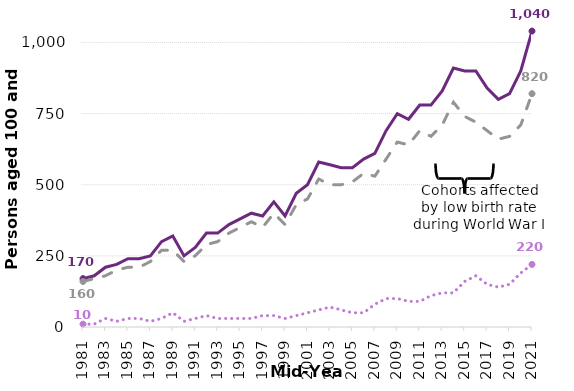
| Category | Persons | Females | Males |
|---|---|---|---|
| 1981.0 | 170 | 160 | 10 |
| 1982.0 | 180 | 170 | 10 |
| 1983.0 | 210 | 180 | 30 |
| 1984.0 | 220 | 200 | 20 |
| 1985.0 | 240 | 210 | 30 |
| 1986.0 | 240 | 210 | 30 |
| 1987.0 | 250 | 230 | 20 |
| 1988.0 | 300 | 270 | 30 |
| 1989.0 | 320 | 270 | 50 |
| 1990.0 | 250 | 230 | 20 |
| 1991.0 | 280 | 250 | 30 |
| 1992.0 | 330 | 290 | 40 |
| 1993.0 | 330 | 300 | 30 |
| 1994.0 | 360 | 330 | 30 |
| 1995.0 | 380 | 350 | 30 |
| 1996.0 | 400 | 370 | 30 |
| 1997.0 | 390 | 350 | 40 |
| 1998.0 | 440 | 400 | 40 |
| 1999.0 | 390 | 360 | 30 |
| 2000.0 | 470 | 430 | 40 |
| 2001.0 | 500 | 450 | 50 |
| 2002.0 | 580 | 520 | 60 |
| 2003.0 | 570 | 500 | 70 |
| 2004.0 | 560 | 500 | 60 |
| 2005.0 | 560 | 510 | 50 |
| 2006.0 | 590 | 540 | 50 |
| 2007.0 | 610 | 530 | 80 |
| 2008.0 | 690 | 590 | 100 |
| 2009.0 | 750 | 650 | 100 |
| 2010.0 | 730 | 640 | 90 |
| 2011.0 | 780 | 690 | 90 |
| 2012.0 | 780 | 670 | 110 |
| 2013.0 | 830 | 710 | 120 |
| 2014.0 | 910 | 790 | 120 |
| 2015.0 | 900 | 740 | 160 |
| 2016.0 | 900 | 720 | 180 |
| 2017.0 | 840 | 690 | 150 |
| 2018.0 | 800 | 660 | 140 |
| 2019.0 | 820 | 670 | 150 |
| 2020.0 | 900 | 710 | 190 |
| 2021.0 | 1040 | 820 | 220 |